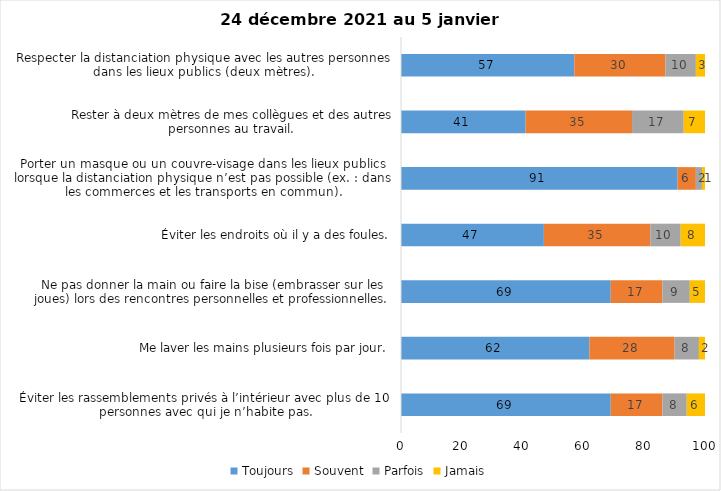
| Category | Toujours | Souvent | Parfois | Jamais |
|---|---|---|---|---|
| Éviter les rassemblements privés à l’intérieur avec plus de 10 personnes avec qui je n’habite pas. | 69 | 17 | 8 | 6 |
| Me laver les mains plusieurs fois par jour. | 62 | 28 | 8 | 2 |
| Ne pas donner la main ou faire la bise (embrasser sur les joues) lors des rencontres personnelles et professionnelles. | 69 | 17 | 9 | 5 |
| Éviter les endroits où il y a des foules. | 47 | 35 | 10 | 8 |
| Porter un masque ou un couvre-visage dans les lieux publics lorsque la distanciation physique n’est pas possible (ex. : dans les commerces et les transports en commun). | 91 | 6 | 2 | 1 |
| Rester à deux mètres de mes collègues et des autres personnes au travail. | 41 | 35 | 17 | 7 |
| Respecter la distanciation physique avec les autres personnes dans les lieux publics (deux mètres). | 57 | 30 | 10 | 3 |